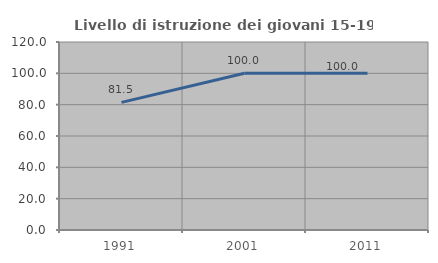
| Category | Livello di istruzione dei giovani 15-19 anni |
|---|---|
| 1991.0 | 81.481 |
| 2001.0 | 100 |
| 2011.0 | 100 |